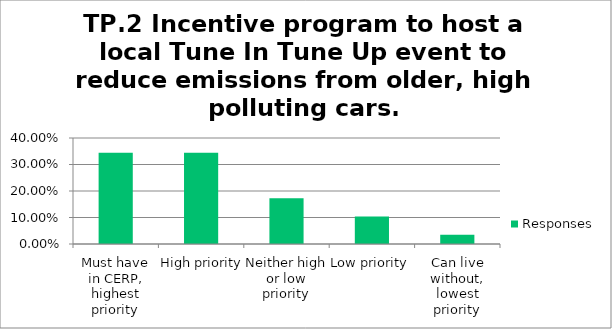
| Category | Responses |
|---|---|
| Must have in CERP, highest priority | 0.345 |
| High priority | 0.345 |
| Neither high or low priority | 0.172 |
| Low priority | 0.103 |
| Can live without, lowest priority | 0.034 |